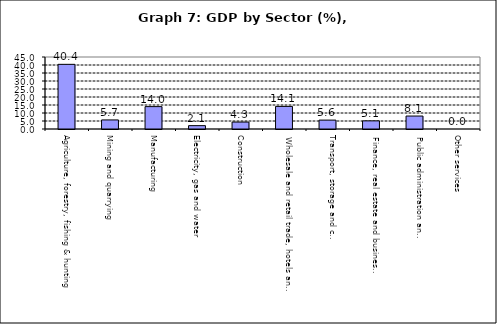
| Category | Series 0 |
|---|---|
| Agriculture, forestry, fishing & hunting | 40.414 |
| Mining and quarrying  | 5.669 |
| Manufacturing | 13.988 |
| Electricity, gas and water | 2.093 |
| Construction | 4.344 |
| Wholesale and retail trade, hotels and restaurants  | 14.113 |
| Transport, storage and communication                | 5.563 |
| Finance, real estate and business services          | 5.078 |
| Public administration and Defense                       | 8.098 |
| Other services                                    | 0 |